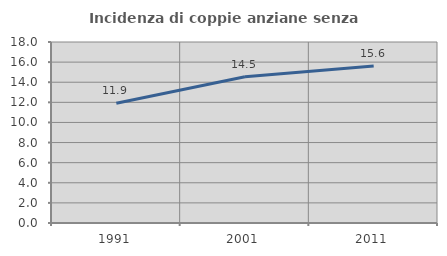
| Category | Incidenza di coppie anziane senza figli  |
|---|---|
| 1991.0 | 11.905 |
| 2001.0 | 14.539 |
| 2011.0 | 15.611 |